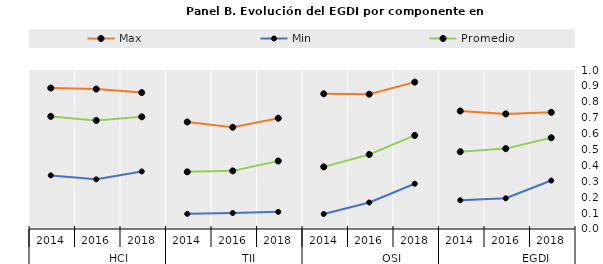
| Category | Max | Min |
|---|---|---|
| 0 | 0.734 | 0.305 |
| 1 | 0.724 | 0.193 |
| 2 | 0.742 | 0.181 |
| 3 | 0.924 | 0.285 |
| 4 | 0.848 | 0.167 |
| 5 | 0.85 | 0.094 |
| 6 | 0.697 | 0.108 |
| 7 | 0.64 | 0.1 |
| 8 | 0.673 | 0.095 |
| 9 | 0.858 | 0.362 |
| 10 | 0.88 | 0.312 |
| 11 | 0.886 | 0.337 |